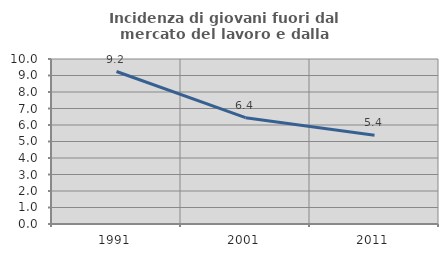
| Category | Incidenza di giovani fuori dal mercato del lavoro e dalla formazione  |
|---|---|
| 1991.0 | 9.242 |
| 2001.0 | 6.442 |
| 2011.0 | 5.375 |